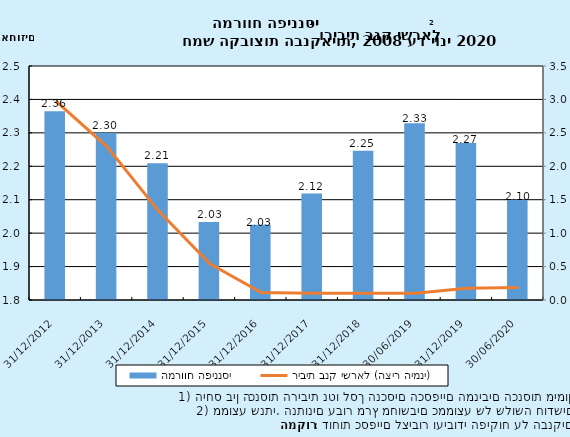
| Category | המרווח הפיננסי |
|---|---|
| 31/12/2012 | 2.365 |
| 31/12/2013 | 2.3 |
| 31/12/2014 | 2.209 |
| 31/12/2015 | 2.033 |
| 31/12/2016 | 2.025 |
| 31/12/2017 | 2.118 |
| 31/12/2018 | 2.247 |
| 30/06/2019 | 2.329 |
| 31/12/2019 | 2.27 |
| 30/06/2020 | 2.1 |